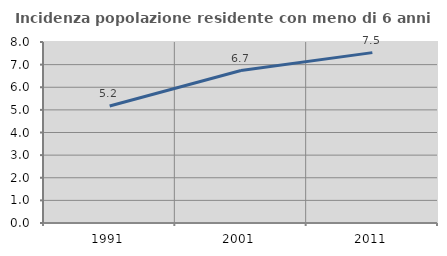
| Category | Incidenza popolazione residente con meno di 6 anni |
|---|---|
| 1991.0 | 5.172 |
| 2001.0 | 6.739 |
| 2011.0 | 7.53 |